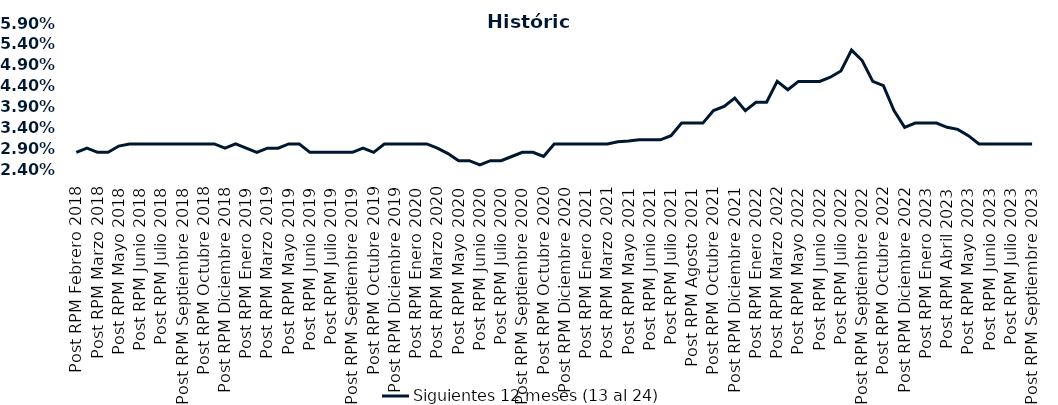
| Category | Siguientes 12 meses (13 al 24)  |
|---|---|
| Post RPM Febrero 2018 | 0.028 |
| Pre RPM Marzo 2018 | 0.029 |
| Post RPM Marzo 2018 | 0.028 |
| Pre RPM Mayo 2018 | 0.028 |
| Post RPM Mayo 2018 | 0.03 |
| Pre RPM Junio 2018 | 0.03 |
| Post RPM Junio 2018 | 0.03 |
| Pre RPM Julio 2018 | 0.03 |
| Post RPM Julio 2018 | 0.03 |
| Pre RPM Septiembre 2018 | 0.03 |
| Post RPM Septiembre 2018 | 0.03 |
| Pre RPM Octubre 2018 | 0.03 |
| Post RPM Octubre 2018 | 0.03 |
| Pre RPM Diciembre 2018 | 0.03 |
| Post RPM Diciembre 2018 | 0.029 |
| Pre RPM Enero 2019 | 0.03 |
| Post RPM Enero 2019 | 0.029 |
| Pre RPM Marzo 2019 | 0.028 |
| Post RPM Marzo 2019 | 0.029 |
| Pre RPM Mayo 2019 | 0.029 |
| Post RPM Mayo 2019 | 0.03 |
| Pre RPM Junio 2019 | 0.03 |
| Post RPM Junio 2019 | 0.028 |
| Pre RPM Julio 2019 | 0.028 |
| Post RPM Julio 2019 | 0.028 |
| Pre RPM Septiembre 2019 | 0.028 |
| Post RPM Septiembre 2019 | 0.028 |
| Pre RPM Octubre 2019 | 0.029 |
| Post RPM Octubre 2019 | 0.028 |
| Pre RPM Diciembre 2019 | 0.03 |
| Post RPM Diciembre 2019 | 0.03 |
| Pre RPM Enero 2020 | 0.03 |
| Post RPM Enero 2020 | 0.03 |
| Pre RPM Marzo 2020 | 0.03 |
| Post RPM Marzo 2020 | 0.029 |
| Pre RPM Mayo 2020 | 0.028 |
| Post RPM Mayo 2020 | 0.026 |
| Pre RPM Junio 2020 | 0.026 |
| Post RPM Junio 2020 | 0.025 |
| Pre RPM Julio 2020 | 0.026 |
| Post RPM Julio 2020 | 0.026 |
| Pre RPM Septiembre 2020 | 0.027 |
| Post RPM Septiembre 2020 | 0.028 |
| Pre RPM Octubre 2020 | 0.028 |
| Post RPM Octubre 2020 | 0.027 |
| Pre RPM Diciembre 2020 | 0.03 |
| Post RPM Diciembre 2020 | 0.03 |
| Pre RPM Enero 2021 | 0.03 |
| Post RPM Enero 2021 | 0.03 |
| Pre RPM Marzo 2021 | 0.03 |
| Post RPM Marzo 2021 | 0.03 |
| Pre RPM Mayo 2021 | 0.031 |
| Post RPM Mayo 2021 | 0.031 |
| Pre RPM Junio 2021 | 0.031 |
| Post RPM Junio 2021 | 0.031 |
| Pre RPM Julio 2021 | 0.031 |
| Post RPM Julio 2021 | 0.032 |
| Pre RPM Agosto 2021 | 0.035 |
| Post RPM Agosto 2021 | 0.035 |
| Pre RPM Octubre 2021 | 0.035 |
| Post RPM Octubre 2021 | 0.038 |
| Pre RPM Diciembre 2021 | 0.039 |
| Post RPM Diciembre 2021 | 0.041 |
| Pre RPM Enero 2022 | 0.038 |
| Post RPM Enero 2022 | 0.04 |
| Pre RPM Marzo 2022 | 0.04 |
| Post RPM Marzo 2022 | 0.045 |
| Pre RPM Mayo 2022 | 0.043 |
| Post RPM Mayo 2022 | 0.045 |
| Pre RPM Junio 2022 | 0.045 |
| Post RPM Junio 2022 | 0.045 |
| Pre RPM Julio 2022 | 0.046 |
| Post RPM Julio 2022 | 0.048 |
| Pre RPM Septiembre 2022 | 0.052 |
| Post RPM Septiembre 2022 | 0.05 |
| Pre RPM Octubre 2022 | 0.045 |
| Post RPM Octubre 2022 | 0.044 |
| Pre RPM Diciembre 2022 | 0.038 |
| Post RPM Diciembre 2022 | 0.034 |
| Pre RPM Enero 2023 | 0.035 |
| Post RPM Enero 2023 | 0.035 |
| Pre RPM Abril 2023 | 0.035 |
| Post RPM Abril 2023 | 0.034 |
| Pre RPM Mayo 2023 | 0.034 |
| Post RPM Mayo 2023 | 0.032 |
| Pre RPM Junio 2023 | 0.03 |
| Post RPM Junio 2023 | 0.03 |
| Pre RPM Julio 2023 | 0.03 |
| Post RPM Julio 2023 | 0.03 |
| Pre RPM Septiembre 2023 | 0.03 |
| Post RPM Septiembre 2023 | 0.03 |